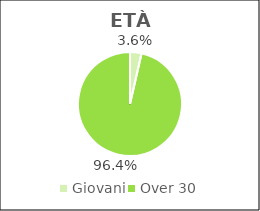
| Category | Series 0 |
|---|---|
| Giovani | 2511 |
| Over 30 | 67700 |